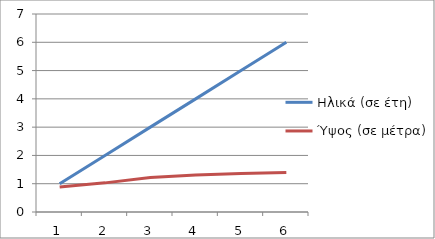
| Category | Ηλικά (σε έτη) | Ύψος (σε μέτρα) |
|---|---|---|
| 0 | 1 | 0.88 |
| 1 | 2 | 1.03 |
| 2 | 3 | 1.22 |
| 3 | 4 | 1.31 |
| 4 | 5 | 1.36 |
| 5 | 6 | 1.4 |